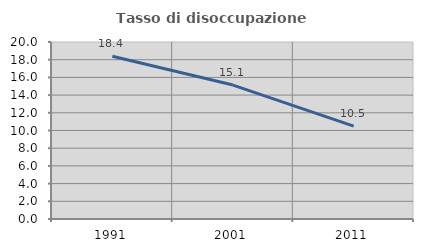
| Category | Tasso di disoccupazione giovanile  |
|---|---|
| 1991.0 | 18.395 |
| 2001.0 | 15.135 |
| 2011.0 | 10.494 |